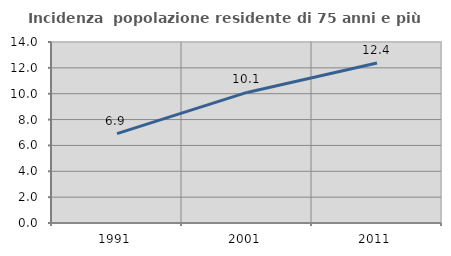
| Category | Incidenza  popolazione residente di 75 anni e più |
|---|---|
| 1991.0 | 6.91 |
| 2001.0 | 10.1 |
| 2011.0 | 12.376 |